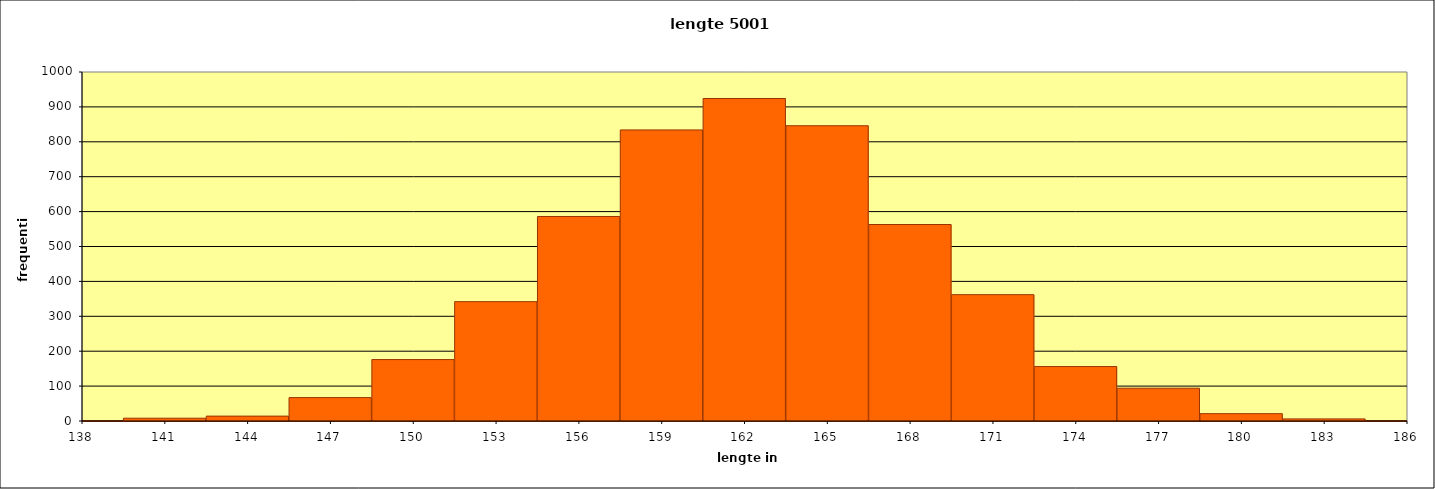
| Category | Series 0 |
|---|---|
| 186.0 | 1 |
| 183.0 | 6 |
| 180.0 | 21 |
| 177.0 | 94 |
| 174.0 | 156 |
| 171.0 | 362 |
| 168.0 | 563 |
| 165.0 | 846 |
| 162.0 | 924 |
| 159.0 | 834 |
| 156.0 | 586 |
| 153.0 | 342 |
| 150.0 | 176 |
| 147.0 | 67 |
| 144.0 | 14 |
| 141.0 | 8 |
| 138.0 | 1 |